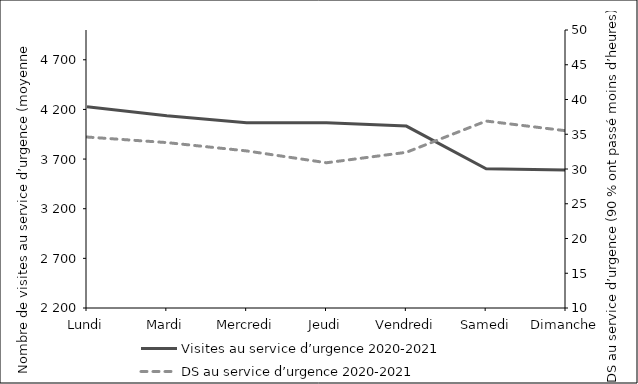
| Category | Visites au service d’urgence 2020-2021 |
|---|---|
| Lundi | 4227 |
| Mardi | 4136 |
| Mercredi | 4067 |
| Jeudi | 4066 |
| Vendredi | 4032 |
| Samedi | 3602 |
| Dimanche | 3591 |